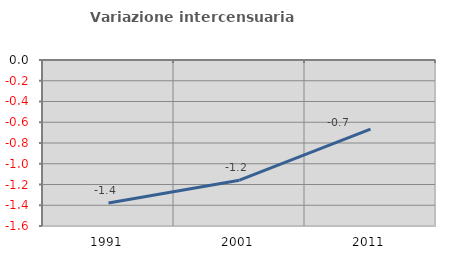
| Category | Variazione intercensuaria annua |
|---|---|
| 1991.0 | -1.378 |
| 2001.0 | -1.158 |
| 2011.0 | -0.666 |